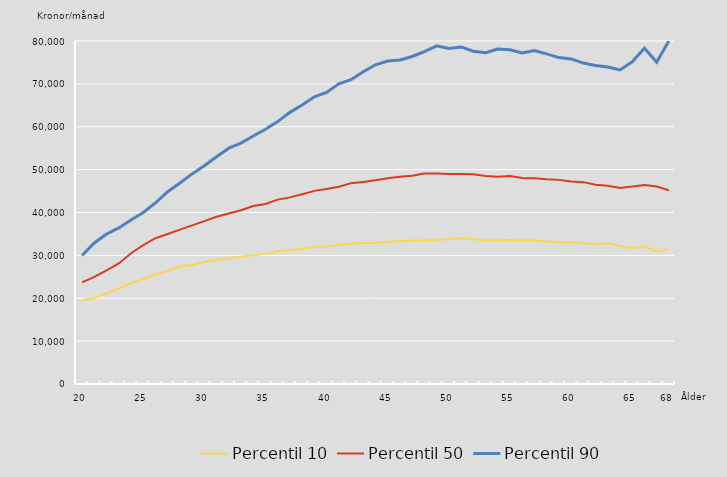
| Category | Percentil 10 | Percentil 50 | Percentil 90 |
|---|---|---|---|
| 20.0 | 19516 | 23687 | 30000 |
| nan | 20066 | 25000 | 32886 |
| nan | 21182 | 26500 | 35000 |
| nan | 22272 | 28109 | 36400 |
| nan | 23490 | 30500 | 38250 |
| 25.0 | 24409 | 32377 | 40000 |
| nan | 25590 | 34000 | 42231 |
| nan | 26321 | 35000 | 44860 |
| nan | 27330 | 36000 | 46863 |
| nan | 27750 | 37000 | 49000 |
| 30.0 | 28446 | 38000 | 50900 |
| nan | 28968 | 39000 | 53000 |
| nan | 29284 | 39783 | 55000 |
| nan | 29764 | 40525 | 56200 |
| nan | 30000 | 41500 | 57843 |
| 35.0 | 30353 | 42000 | 59429 |
| nan | 30969 | 43000 | 61200 |
| nan | 31271 | 43525 | 63361 |
| nan | 31571 | 44237 | 65049 |
| nan | 32000 | 45047 | 67000 |
| 40.0 | 32054 | 45500 | 68000 |
| nan | 32494 | 46000 | 70000 |
| nan | 32772 | 46850 | 70973 |
| nan | 32875 | 47103 | 72843 |
| nan | 32950 | 47518 | 74453 |
| 45.0 | 33106 | 48000 | 75316 |
| nan | 33374 | 48345 | 75583 |
| nan | 33445 | 48548 | 76387 |
| nan | 33507 | 49107 | 77526 |
| nan | 33650 | 49109 | 78882 |
| 50.0 | 33762 | 49000 | 78257 |
| nan | 33972 | 48987 | 78618 |
| nan | 33779 | 48902 | 77616 |
| nan | 33500 | 48500 | 77262 |
| nan | 33550 | 48360 | 78132 |
| 55.0 | 33600 | 48500 | 77940 |
| nan | 33500 | 48054 | 77200 |
| nan | 33510 | 48000 | 77761 |
| nan | 33244 | 47740 | 77000 |
| nan | 33000 | 47610 | 76137 |
| 60.0 | 33035 | 47231 | 75827 |
| nan | 32800 | 47080 | 74853 |
| nan | 32635 | 46473 | 74300 |
| nan | 32834 | 46250 | 73950 |
| nan | 32190 | 45700 | 73235 |
| 65.0 | 31656 | 46040 | 75156 |
| nan | 32049 | 46400 | 78300 |
| nan | 30960 | 46075 | 75075 |
| 68.0 | 31409 | 45200 | 80000 |